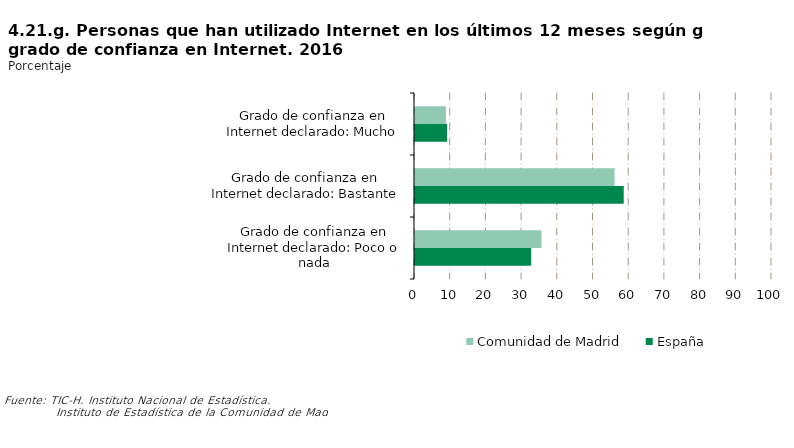
| Category | Comunidad de Madrid | España |
|---|---|---|
| Grado de confianza en Internet declarado: Mucho | 8.666 | 8.988 |
| Grado de confianza en Internet declarado: Bastante | 55.896 | 58.466 |
| Grado de confianza en Internet declarado: Poco o nada | 35.438 | 32.547 |